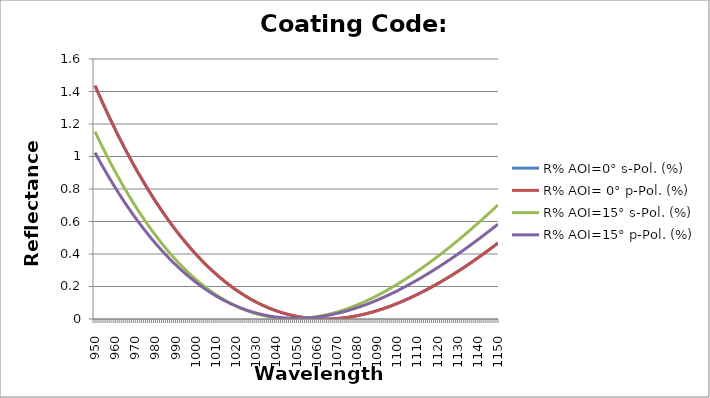
| Category | R% AOI=0° s-Pol. (%) | R% AOI= 0° p-Pol. (%) | R% AOI=15° s-Pol. (%) | R% AOI=15° p-Pol. (%) |
|---|---|---|---|---|
| 950.0 | 1.436 | 1.436 | 1.153 | 1.024 |
| 951.0 | 1.408 | 1.408 | 1.127 | 1.001 |
| 952.0 | 1.38 | 1.38 | 1.101 | 0.978 |
| 953.0 | 1.352 | 1.352 | 1.076 | 0.956 |
| 954.0 | 1.325 | 1.325 | 1.051 | 0.934 |
| 955.0 | 1.298 | 1.298 | 1.026 | 0.913 |
| 956.0 | 1.271 | 1.271 | 1.002 | 0.891 |
| 957.0 | 1.244 | 1.244 | 0.978 | 0.87 |
| 958.0 | 1.218 | 1.218 | 0.954 | 0.85 |
| 959.0 | 1.193 | 1.193 | 0.93 | 0.829 |
| 960.0 | 1.167 | 1.167 | 0.908 | 0.809 |
| 961.0 | 1.142 | 1.142 | 0.885 | 0.789 |
| 962.0 | 1.117 | 1.117 | 0.862 | 0.77 |
| 963.0 | 1.093 | 1.093 | 0.84 | 0.75 |
| 964.0 | 1.069 | 1.069 | 0.819 | 0.732 |
| 965.0 | 1.045 | 1.045 | 0.797 | 0.713 |
| 966.0 | 1.022 | 1.022 | 0.776 | 0.694 |
| 967.0 | 0.998 | 0.998 | 0.756 | 0.676 |
| 968.0 | 0.975 | 0.975 | 0.735 | 0.658 |
| 969.0 | 0.953 | 0.953 | 0.715 | 0.641 |
| 970.0 | 0.931 | 0.931 | 0.696 | 0.624 |
| 971.0 | 0.909 | 0.909 | 0.676 | 0.607 |
| 972.0 | 0.887 | 0.887 | 0.657 | 0.59 |
| 973.0 | 0.866 | 0.866 | 0.638 | 0.574 |
| 974.0 | 0.845 | 0.845 | 0.62 | 0.557 |
| 975.0 | 0.824 | 0.824 | 0.602 | 0.541 |
| 976.0 | 0.804 | 0.804 | 0.584 | 0.526 |
| 977.0 | 0.783 | 0.783 | 0.566 | 0.51 |
| 978.0 | 0.764 | 0.764 | 0.549 | 0.495 |
| 979.0 | 0.744 | 0.744 | 0.532 | 0.48 |
| 980.0 | 0.725 | 0.725 | 0.516 | 0.466 |
| 981.0 | 0.706 | 0.706 | 0.499 | 0.452 |
| 982.0 | 0.687 | 0.687 | 0.483 | 0.438 |
| 983.0 | 0.669 | 0.669 | 0.468 | 0.424 |
| 984.0 | 0.651 | 0.651 | 0.452 | 0.41 |
| 985.0 | 0.633 | 0.633 | 0.437 | 0.397 |
| 986.0 | 0.616 | 0.616 | 0.422 | 0.384 |
| 987.0 | 0.598 | 0.598 | 0.408 | 0.371 |
| 988.0 | 0.581 | 0.581 | 0.393 | 0.358 |
| 989.0 | 0.565 | 0.565 | 0.379 | 0.346 |
| 990.0 | 0.548 | 0.548 | 0.366 | 0.334 |
| 991.0 | 0.532 | 0.532 | 0.352 | 0.322 |
| 992.0 | 0.516 | 0.516 | 0.339 | 0.311 |
| 993.0 | 0.501 | 0.501 | 0.326 | 0.299 |
| 994.0 | 0.486 | 0.486 | 0.314 | 0.288 |
| 995.0 | 0.471 | 0.471 | 0.302 | 0.278 |
| 996.0 | 0.456 | 0.456 | 0.29 | 0.267 |
| 997.0 | 0.441 | 0.441 | 0.278 | 0.256 |
| 998.0 | 0.427 | 0.427 | 0.266 | 0.246 |
| 999.0 | 0.413 | 0.413 | 0.255 | 0.236 |
| 1000.0 | 0.4 | 0.4 | 0.244 | 0.227 |
| 1001.0 | 0.386 | 0.386 | 0.234 | 0.217 |
| 1002.0 | 0.373 | 0.373 | 0.223 | 0.208 |
| 1003.0 | 0.36 | 0.36 | 0.213 | 0.199 |
| 1004.0 | 0.348 | 0.348 | 0.203 | 0.19 |
| 1005.0 | 0.335 | 0.335 | 0.194 | 0.182 |
| 1006.0 | 0.323 | 0.323 | 0.184 | 0.174 |
| 1007.0 | 0.311 | 0.311 | 0.175 | 0.166 |
| 1008.0 | 0.3 | 0.3 | 0.166 | 0.158 |
| 1009.0 | 0.288 | 0.288 | 0.158 | 0.15 |
| 1010.0 | 0.277 | 0.277 | 0.15 | 0.142 |
| 1011.0 | 0.266 | 0.266 | 0.142 | 0.135 |
| 1012.0 | 0.256 | 0.256 | 0.134 | 0.128 |
| 1013.0 | 0.245 | 0.245 | 0.126 | 0.121 |
| 1014.0 | 0.235 | 0.235 | 0.119 | 0.115 |
| 1015.0 | 0.225 | 0.225 | 0.112 | 0.108 |
| 1016.0 | 0.215 | 0.215 | 0.105 | 0.102 |
| 1017.0 | 0.206 | 0.206 | 0.098 | 0.096 |
| 1018.0 | 0.197 | 0.197 | 0.092 | 0.09 |
| 1019.0 | 0.188 | 0.188 | 0.086 | 0.085 |
| 1020.0 | 0.179 | 0.179 | 0.08 | 0.08 |
| 1021.0 | 0.171 | 0.171 | 0.074 | 0.074 |
| 1022.0 | 0.162 | 0.162 | 0.068 | 0.069 |
| 1023.0 | 0.154 | 0.154 | 0.063 | 0.065 |
| 1024.0 | 0.146 | 0.146 | 0.058 | 0.06 |
| 1025.0 | 0.139 | 0.139 | 0.053 | 0.056 |
| 1026.0 | 0.131 | 0.131 | 0.049 | 0.051 |
| 1027.0 | 0.124 | 0.124 | 0.044 | 0.047 |
| 1028.0 | 0.117 | 0.117 | 0.04 | 0.044 |
| 1029.0 | 0.111 | 0.111 | 0.036 | 0.04 |
| 1030.0 | 0.104 | 0.104 | 0.033 | 0.036 |
| 1031.0 | 0.098 | 0.098 | 0.029 | 0.033 |
| 1032.0 | 0.092 | 0.092 | 0.026 | 0.03 |
| 1033.0 | 0.086 | 0.086 | 0.023 | 0.027 |
| 1034.0 | 0.08 | 0.08 | 0.02 | 0.024 |
| 1035.0 | 0.075 | 0.075 | 0.017 | 0.022 |
| 1036.0 | 0.069 | 0.069 | 0.015 | 0.02 |
| 1037.0 | 0.064 | 0.064 | 0.013 | 0.017 |
| 1038.0 | 0.06 | 0.06 | 0.011 | 0.015 |
| 1039.0 | 0.055 | 0.055 | 0.009 | 0.014 |
| 1040.0 | 0.05 | 0.05 | 0.007 | 0.012 |
| 1041.0 | 0.046 | 0.046 | 0.006 | 0.01 |
| 1042.0 | 0.042 | 0.042 | 0.005 | 0.009 |
| 1043.0 | 0.038 | 0.038 | 0.004 | 0.008 |
| 1044.0 | 0.035 | 0.035 | 0.003 | 0.007 |
| 1045.0 | 0.031 | 0.031 | 0.002 | 0.006 |
| 1046.0 | 0.028 | 0.028 | 0.002 | 0.005 |
| 1047.0 | 0.025 | 0.025 | 0.001 | 0.005 |
| 1048.0 | 0.022 | 0.022 | 0.001 | 0.004 |
| 1049.0 | 0.019 | 0.019 | 0.001 | 0.004 |
| 1050.0 | 0.017 | 0.017 | 0.001 | 0.004 |
| 1051.0 | 0.014 | 0.014 | 0.002 | 0.004 |
| 1052.0 | 0.012 | 0.012 | 0.002 | 0.004 |
| 1053.0 | 0.01 | 0.01 | 0.003 | 0.005 |
| 1054.0 | 0.008 | 0.008 | 0.004 | 0.006 |
| 1055.0 | 0.007 | 0.007 | 0.005 | 0.006 |
| 1056.0 | 0.005 | 0.005 | 0.007 | 0.007 |
| 1057.0 | 0.004 | 0.004 | 0.008 | 0.008 |
| 1058.0 | 0.003 | 0.003 | 0.01 | 0.009 |
| 1059.0 | 0.002 | 0.002 | 0.012 | 0.01 |
| 1060.0 | 0.001 | 0.001 | 0.014 | 0.012 |
| 1061.0 | 0.001 | 0.001 | 0.016 | 0.014 |
| 1062.0 | 0 | 0 | 0.018 | 0.015 |
| 1063.0 | 0 | 0 | 0.021 | 0.017 |
| 1064.0 | 0 | 0 | 0.023 | 0.019 |
| 1065.0 | 0 | 0 | 0.026 | 0.021 |
| 1066.0 | 0 | 0 | 0.029 | 0.024 |
| 1067.0 | 0.001 | 0.001 | 0.032 | 0.026 |
| 1068.0 | 0.001 | 0.001 | 0.036 | 0.029 |
| 1069.0 | 0.002 | 0.002 | 0.039 | 0.031 |
| 1070.0 | 0.003 | 0.003 | 0.042 | 0.034 |
| 1071.0 | 0.004 | 0.004 | 0.046 | 0.037 |
| 1072.0 | 0.005 | 0.005 | 0.05 | 0.04 |
| 1073.0 | 0.006 | 0.006 | 0.054 | 0.043 |
| 1074.0 | 0.008 | 0.008 | 0.058 | 0.047 |
| 1075.0 | 0.01 | 0.01 | 0.063 | 0.05 |
| 1076.0 | 0.011 | 0.011 | 0.067 | 0.054 |
| 1077.0 | 0.013 | 0.013 | 0.072 | 0.057 |
| 1078.0 | 0.015 | 0.015 | 0.076 | 0.061 |
| 1079.0 | 0.018 | 0.018 | 0.081 | 0.065 |
| 1080.0 | 0.02 | 0.02 | 0.086 | 0.069 |
| 1081.0 | 0.022 | 0.022 | 0.092 | 0.073 |
| 1082.0 | 0.025 | 0.025 | 0.097 | 0.078 |
| 1083.0 | 0.028 | 0.028 | 0.102 | 0.082 |
| 1084.0 | 0.031 | 0.031 | 0.108 | 0.087 |
| 1085.0 | 0.034 | 0.034 | 0.114 | 0.091 |
| 1086.0 | 0.037 | 0.037 | 0.119 | 0.096 |
| 1087.0 | 0.04 | 0.04 | 0.125 | 0.101 |
| 1088.0 | 0.044 | 0.044 | 0.131 | 0.106 |
| 1089.0 | 0.048 | 0.048 | 0.138 | 0.111 |
| 1090.0 | 0.051 | 0.051 | 0.144 | 0.116 |
| 1091.0 | 0.055 | 0.055 | 0.15 | 0.121 |
| 1092.0 | 0.059 | 0.059 | 0.157 | 0.127 |
| 1093.0 | 0.063 | 0.063 | 0.164 | 0.132 |
| 1094.0 | 0.068 | 0.068 | 0.17 | 0.138 |
| 1095.0 | 0.072 | 0.072 | 0.177 | 0.144 |
| 1096.0 | 0.076 | 0.076 | 0.184 | 0.149 |
| 1097.0 | 0.081 | 0.081 | 0.192 | 0.155 |
| 1098.0 | 0.086 | 0.086 | 0.199 | 0.161 |
| 1099.0 | 0.091 | 0.091 | 0.206 | 0.167 |
| 1100.0 | 0.096 | 0.096 | 0.214 | 0.174 |
| 1101.0 | 0.101 | 0.101 | 0.221 | 0.18 |
| 1102.0 | 0.106 | 0.106 | 0.229 | 0.186 |
| 1103.0 | 0.111 | 0.111 | 0.237 | 0.193 |
| 1104.0 | 0.117 | 0.117 | 0.245 | 0.199 |
| 1105.0 | 0.122 | 0.122 | 0.253 | 0.206 |
| 1106.0 | 0.128 | 0.128 | 0.261 | 0.213 |
| 1107.0 | 0.134 | 0.134 | 0.269 | 0.22 |
| 1108.0 | 0.139 | 0.139 | 0.277 | 0.226 |
| 1109.0 | 0.145 | 0.145 | 0.286 | 0.234 |
| 1110.0 | 0.151 | 0.151 | 0.294 | 0.241 |
| 1111.0 | 0.157 | 0.157 | 0.303 | 0.248 |
| 1112.0 | 0.164 | 0.164 | 0.311 | 0.255 |
| 1113.0 | 0.17 | 0.17 | 0.32 | 0.262 |
| 1114.0 | 0.176 | 0.176 | 0.329 | 0.27 |
| 1115.0 | 0.183 | 0.183 | 0.338 | 0.277 |
| 1116.0 | 0.19 | 0.19 | 0.347 | 0.285 |
| 1117.0 | 0.196 | 0.196 | 0.356 | 0.292 |
| 1118.0 | 0.203 | 0.203 | 0.365 | 0.3 |
| 1119.0 | 0.21 | 0.21 | 0.374 | 0.308 |
| 1120.0 | 0.217 | 0.217 | 0.384 | 0.316 |
| 1121.0 | 0.224 | 0.224 | 0.393 | 0.324 |
| 1122.0 | 0.232 | 0.232 | 0.403 | 0.332 |
| 1123.0 | 0.239 | 0.239 | 0.413 | 0.34 |
| 1124.0 | 0.246 | 0.246 | 0.422 | 0.348 |
| 1125.0 | 0.254 | 0.254 | 0.432 | 0.356 |
| 1126.0 | 0.261 | 0.261 | 0.442 | 0.365 |
| 1127.0 | 0.269 | 0.269 | 0.452 | 0.373 |
| 1128.0 | 0.277 | 0.277 | 0.462 | 0.382 |
| 1129.0 | 0.284 | 0.284 | 0.472 | 0.39 |
| 1130.0 | 0.292 | 0.292 | 0.482 | 0.399 |
| 1131.0 | 0.3 | 0.3 | 0.493 | 0.407 |
| 1132.0 | 0.308 | 0.308 | 0.503 | 0.416 |
| 1133.0 | 0.317 | 0.317 | 0.514 | 0.425 |
| 1134.0 | 0.325 | 0.325 | 0.524 | 0.434 |
| 1135.0 | 0.333 | 0.333 | 0.535 | 0.443 |
| 1136.0 | 0.342 | 0.342 | 0.545 | 0.452 |
| 1137.0 | 0.35 | 0.35 | 0.556 | 0.461 |
| 1138.0 | 0.359 | 0.359 | 0.567 | 0.47 |
| 1139.0 | 0.368 | 0.368 | 0.578 | 0.479 |
| 1140.0 | 0.376 | 0.376 | 0.589 | 0.488 |
| 1141.0 | 0.385 | 0.385 | 0.6 | 0.497 |
| 1142.0 | 0.394 | 0.394 | 0.611 | 0.507 |
| 1143.0 | 0.403 | 0.403 | 0.622 | 0.516 |
| 1144.0 | 0.412 | 0.412 | 0.633 | 0.526 |
| 1145.0 | 0.421 | 0.421 | 0.645 | 0.535 |
| 1146.0 | 0.43 | 0.43 | 0.656 | 0.545 |
| 1147.0 | 0.439 | 0.439 | 0.667 | 0.554 |
| 1148.0 | 0.449 | 0.449 | 0.679 | 0.564 |
| 1149.0 | 0.458 | 0.458 | 0.69 | 0.574 |
| 1150.0 | 0.468 | 0.468 | 0.702 | 0.584 |